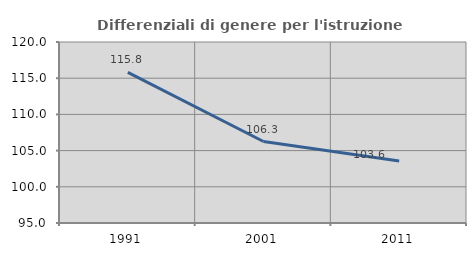
| Category | Differenziali di genere per l'istruzione superiore |
|---|---|
| 1991.0 | 115.807 |
| 2001.0 | 106.254 |
| 2011.0 | 103.554 |